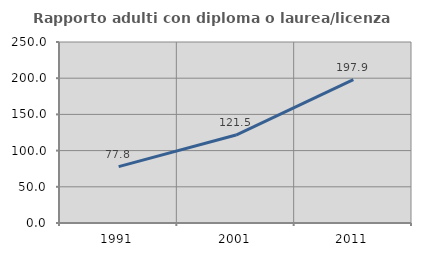
| Category | Rapporto adulti con diploma o laurea/licenza media  |
|---|---|
| 1991.0 | 77.838 |
| 2001.0 | 121.466 |
| 2011.0 | 197.92 |